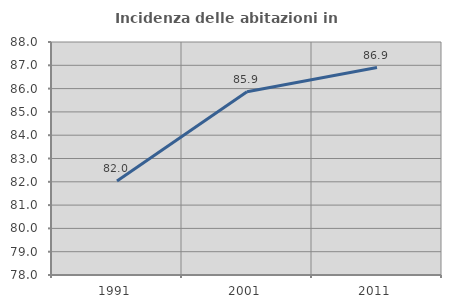
| Category | Incidenza delle abitazioni in proprietà  |
|---|---|
| 1991.0 | 82.035 |
| 2001.0 | 85.866 |
| 2011.0 | 86.905 |